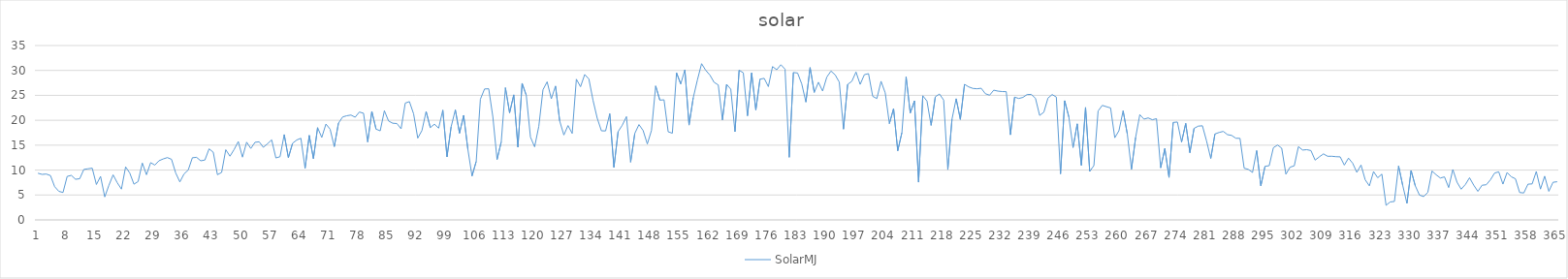
| Category | SolarMJ |
|---|---|
| 0 | 9.362 |
| 1 | 9.136 |
| 2 | 9.207 |
| 3 | 8.893 |
| 4 | 6.673 |
| 5 | 5.735 |
| 6 | 5.501 |
| 7 | 8.73 |
| 8 | 8.938 |
| 9 | 8.152 |
| 10 | 8.267 |
| 11 | 10.137 |
| 12 | 10.26 |
| 13 | 10.388 |
| 14 | 7.109 |
| 15 | 8.733 |
| 16 | 4.612 |
| 17 | 6.954 |
| 18 | 9.046 |
| 19 | 7.463 |
| 20 | 6.182 |
| 21 | 10.641 |
| 22 | 9.404 |
| 23 | 7.176 |
| 24 | 7.707 |
| 25 | 11.42 |
| 26 | 9.068 |
| 27 | 11.491 |
| 28 | 11.002 |
| 29 | 11.879 |
| 30 | 12.234 |
| 31 | 12.509 |
| 32 | 12.161 |
| 33 | 9.422 |
| 34 | 7.627 |
| 35 | 9.224 |
| 36 | 10.015 |
| 37 | 12.477 |
| 38 | 12.553 |
| 39 | 11.86 |
| 40 | 12.02 |
| 41 | 14.264 |
| 42 | 13.591 |
| 43 | 9.073 |
| 44 | 9.522 |
| 45 | 14.088 |
| 46 | 12.79 |
| 47 | 14.136 |
| 48 | 15.733 |
| 49 | 12.596 |
| 50 | 15.601 |
| 51 | 14.346 |
| 52 | 15.575 |
| 53 | 15.677 |
| 54 | 14.575 |
| 55 | 15.29 |
| 56 | 16.064 |
| 57 | 12.436 |
| 58 | 12.682 |
| 59 | 17.126 |
| 60 | 12.492 |
| 61 | 15.371 |
| 62 | 16.039 |
| 63 | 16.386 |
| 64 | 10.353 |
| 65 | 16.965 |
| 66 | 12.296 |
| 67 | 18.52 |
| 68 | 16.548 |
| 69 | 19.24 |
| 70 | 18.198 |
| 71 | 14.71 |
| 72 | 19.422 |
| 73 | 20.668 |
| 74 | 20.906 |
| 75 | 21.044 |
| 76 | 20.612 |
| 77 | 21.654 |
| 78 | 21.412 |
| 79 | 15.638 |
| 80 | 21.778 |
| 81 | 18.218 |
| 82 | 17.878 |
| 83 | 21.919 |
| 84 | 19.863 |
| 85 | 19.405 |
| 86 | 19.347 |
| 87 | 18.276 |
| 88 | 23.448 |
| 89 | 23.741 |
| 90 | 21.289 |
| 91 | 16.415 |
| 92 | 17.935 |
| 93 | 21.766 |
| 94 | 18.534 |
| 95 | 19.215 |
| 96 | 18.417 |
| 97 | 22.037 |
| 98 | 12.638 |
| 99 | 18.71 |
| 100 | 22.088 |
| 101 | 17.405 |
| 102 | 21.003 |
| 103 | 14.202 |
| 104 | 8.806 |
| 105 | 11.735 |
| 106 | 24.204 |
| 107 | 26.279 |
| 108 | 26.323 |
| 109 | 20.619 |
| 110 | 12.107 |
| 111 | 15.668 |
| 112 | 26.535 |
| 113 | 21.498 |
| 114 | 25.101 |
| 115 | 14.609 |
| 116 | 27.42 |
| 117 | 25.013 |
| 118 | 16.613 |
| 119 | 14.67 |
| 120 | 18.791 |
| 121 | 26.123 |
| 122 | 27.716 |
| 123 | 24.308 |
| 124 | 26.862 |
| 125 | 19.87 |
| 126 | 17.043 |
| 127 | 18.936 |
| 128 | 17.35 |
| 129 | 28.239 |
| 130 | 26.739 |
| 131 | 29.184 |
| 132 | 28.284 |
| 133 | 23.964 |
| 134 | 20.411 |
| 135 | 17.882 |
| 136 | 17.864 |
| 137 | 21.317 |
| 138 | 10.556 |
| 139 | 17.713 |
| 140 | 19.013 |
| 141 | 20.736 |
| 142 | 11.585 |
| 143 | 17.358 |
| 144 | 19.133 |
| 145 | 17.933 |
| 146 | 15.247 |
| 147 | 17.963 |
| 148 | 26.891 |
| 149 | 24.039 |
| 150 | 24.105 |
| 151 | 17.682 |
| 152 | 17.4 |
| 153 | 29.529 |
| 154 | 27.282 |
| 155 | 30.139 |
| 156 | 19.035 |
| 157 | 24.503 |
| 158 | 28.087 |
| 159 | 31.357 |
| 160 | 30.021 |
| 161 | 29.063 |
| 162 | 27.615 |
| 163 | 27.091 |
| 164 | 20.059 |
| 165 | 27.215 |
| 166 | 26.232 |
| 167 | 17.696 |
| 168 | 30.04 |
| 169 | 29.528 |
| 170 | 20.893 |
| 171 | 29.51 |
| 172 | 22.077 |
| 173 | 28.252 |
| 174 | 28.413 |
| 175 | 26.753 |
| 176 | 30.776 |
| 177 | 30.138 |
| 178 | 31.142 |
| 179 | 30.254 |
| 180 | 12.571 |
| 181 | 29.585 |
| 182 | 29.482 |
| 183 | 27.3 |
| 184 | 23.654 |
| 185 | 30.579 |
| 186 | 25.586 |
| 187 | 27.634 |
| 188 | 25.869 |
| 189 | 28.664 |
| 190 | 29.875 |
| 191 | 29.122 |
| 192 | 27.643 |
| 193 | 18.22 |
| 194 | 27.198 |
| 195 | 27.823 |
| 196 | 29.683 |
| 197 | 27.203 |
| 198 | 29.15 |
| 199 | 29.359 |
| 200 | 24.806 |
| 201 | 24.358 |
| 202 | 27.822 |
| 203 | 25.504 |
| 204 | 19.327 |
| 205 | 22.342 |
| 206 | 13.878 |
| 207 | 17.529 |
| 208 | 28.719 |
| 209 | 21.456 |
| 210 | 23.896 |
| 211 | 7.576 |
| 212 | 24.908 |
| 213 | 23.869 |
| 214 | 18.976 |
| 215 | 24.707 |
| 216 | 25.267 |
| 217 | 24.053 |
| 218 | 10.093 |
| 219 | 20.238 |
| 220 | 24.326 |
| 221 | 20.17 |
| 222 | 27.208 |
| 223 | 26.705 |
| 224 | 26.391 |
| 225 | 26.323 |
| 226 | 26.423 |
| 227 | 25.322 |
| 228 | 25.027 |
| 229 | 26.038 |
| 230 | 25.855 |
| 231 | 25.759 |
| 232 | 25.745 |
| 233 | 17.081 |
| 234 | 24.638 |
| 235 | 24.372 |
| 236 | 24.597 |
| 237 | 25.162 |
| 238 | 25.189 |
| 239 | 24.404 |
| 240 | 20.974 |
| 241 | 21.614 |
| 242 | 24.457 |
| 243 | 25.155 |
| 244 | 24.653 |
| 245 | 9.238 |
| 246 | 23.928 |
| 247 | 20.646 |
| 248 | 14.525 |
| 249 | 19.282 |
| 250 | 10.955 |
| 251 | 22.575 |
| 252 | 9.727 |
| 253 | 10.908 |
| 254 | 21.846 |
| 255 | 22.989 |
| 256 | 22.72 |
| 257 | 22.47 |
| 258 | 16.492 |
| 259 | 17.901 |
| 260 | 21.896 |
| 261 | 17.272 |
| 262 | 10.158 |
| 263 | 16.565 |
| 264 | 21.133 |
| 265 | 20.226 |
| 266 | 20.474 |
| 267 | 20.102 |
| 268 | 20.321 |
| 269 | 10.449 |
| 270 | 14.334 |
| 271 | 8.526 |
| 272 | 19.568 |
| 273 | 19.654 |
| 274 | 15.623 |
| 275 | 19.365 |
| 276 | 13.496 |
| 277 | 18.371 |
| 278 | 18.82 |
| 279 | 18.893 |
| 280 | 15.818 |
| 281 | 12.338 |
| 282 | 17.25 |
| 283 | 17.553 |
| 284 | 17.766 |
| 285 | 17.114 |
| 286 | 16.961 |
| 287 | 16.392 |
| 288 | 16.364 |
| 289 | 10.372 |
| 290 | 10.143 |
| 291 | 9.52 |
| 292 | 13.915 |
| 293 | 6.84 |
| 294 | 10.752 |
| 295 | 10.883 |
| 296 | 14.487 |
| 297 | 15.032 |
| 298 | 14.401 |
| 299 | 9.171 |
| 300 | 10.585 |
| 301 | 10.853 |
| 302 | 14.706 |
| 303 | 14.021 |
| 304 | 14.096 |
| 305 | 13.918 |
| 306 | 12.003 |
| 307 | 12.648 |
| 308 | 13.253 |
| 309 | 12.772 |
| 310 | 12.775 |
| 311 | 12.689 |
| 312 | 12.656 |
| 313 | 11 |
| 314 | 12.402 |
| 315 | 11.37 |
| 316 | 9.549 |
| 317 | 11.019 |
| 318 | 8.057 |
| 319 | 6.835 |
| 320 | 9.695 |
| 321 | 8.46 |
| 322 | 9.189 |
| 323 | 2.926 |
| 324 | 3.608 |
| 325 | 3.706 |
| 326 | 10.814 |
| 327 | 6.883 |
| 328 | 3.318 |
| 329 | 9.913 |
| 330 | 6.836 |
| 331 | 4.99 |
| 332 | 4.679 |
| 333 | 5.512 |
| 334 | 9.808 |
| 335 | 9.062 |
| 336 | 8.406 |
| 337 | 8.632 |
| 338 | 6.491 |
| 339 | 10.115 |
| 340 | 7.566 |
| 341 | 6.162 |
| 342 | 7.105 |
| 343 | 8.462 |
| 344 | 6.977 |
| 345 | 5.726 |
| 346 | 6.962 |
| 347 | 7.053 |
| 348 | 8.042 |
| 349 | 9.397 |
| 350 | 9.647 |
| 351 | 7.187 |
| 352 | 9.514 |
| 353 | 8.662 |
| 354 | 8.255 |
| 355 | 5.498 |
| 356 | 5.41 |
| 357 | 7.177 |
| 358 | 7.226 |
| 359 | 9.72 |
| 360 | 6.188 |
| 361 | 8.779 |
| 362 | 5.735 |
| 363 | 7.553 |
| 364 | 7.661 |